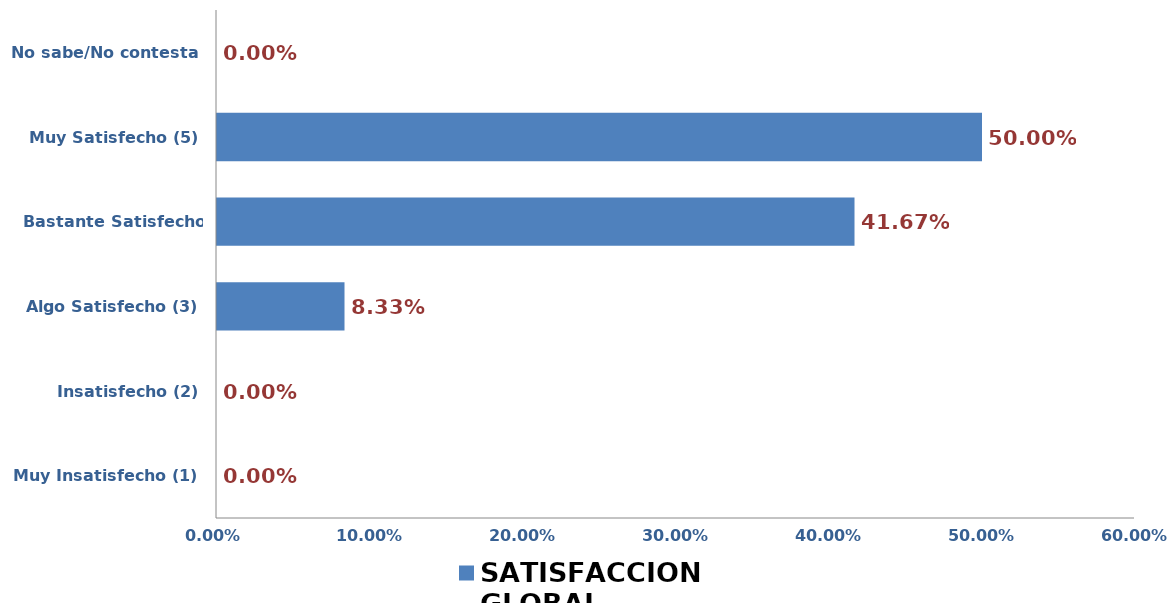
| Category | SATISFACCIÓN GLOBAL |
|---|---|
| Muy Insatisfecho (1) | 0 |
| Insatisfecho (2) | 0 |
| Algo Satisfecho (3) | 0.083 |
| Bastante Satisfecho (4) | 0.417 |
| Muy Satisfecho (5) | 0.5 |
| No sabe/No contesta | 0 |